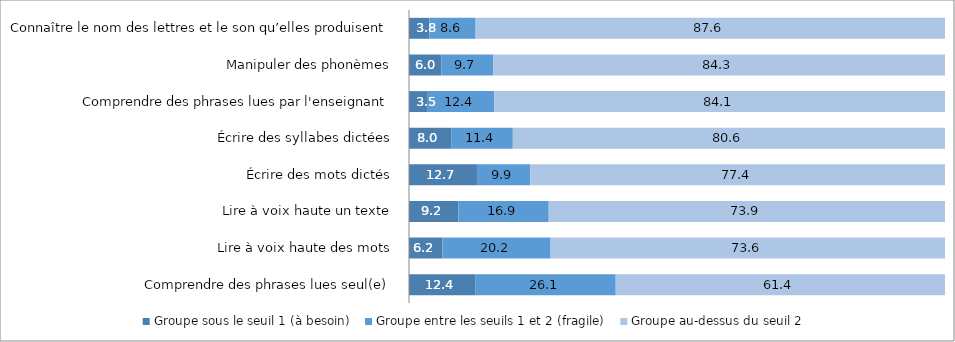
| Category | Groupe sous le seuil 1 (à besoin) | Groupe entre les seuils 1 et 2 (fragile) | Groupe au-dessus du seuil 2 |
|---|---|---|---|
| Comprendre des phrases lues seul(e) | 12.44 | 26.13 | 61.43 |
| Lire à voix haute des mots | 6.24 | 20.17 | 73.59 |
| Lire à voix haute un texte | 9.21 | 16.86 | 73.93 |
| Écrire des mots dictés | 12.68 | 9.94 | 77.38 |
| Écrire des syllabes dictées | 7.96 | 11.41 | 80.62 |
| Comprendre des phrases lues par l'enseignant | 3.51 | 12.41 | 84.08 |
| Manipuler des phonèmes | 6.04 | 9.7 | 84.25 |
| Connaître le nom des lettres et le son qu’elles produisent | 3.81 | 8.62 | 87.58 |